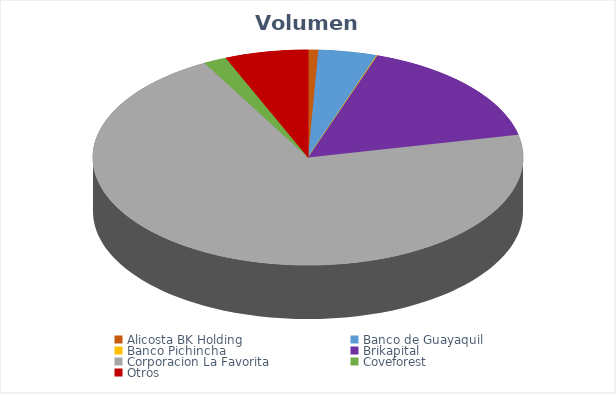
| Category | VOLUMEN ($USD) |
|---|---|
| Alicosta BK Holding | 800 |
| Banco de Guayaquil | 4534.6 |
| Banco Pichincha | 71 |
| Brikapital | 17000 |
| Corporacion La Favorita | 73053.1 |
| Coveforest | 1801.8 |
| Otros | 6470 |